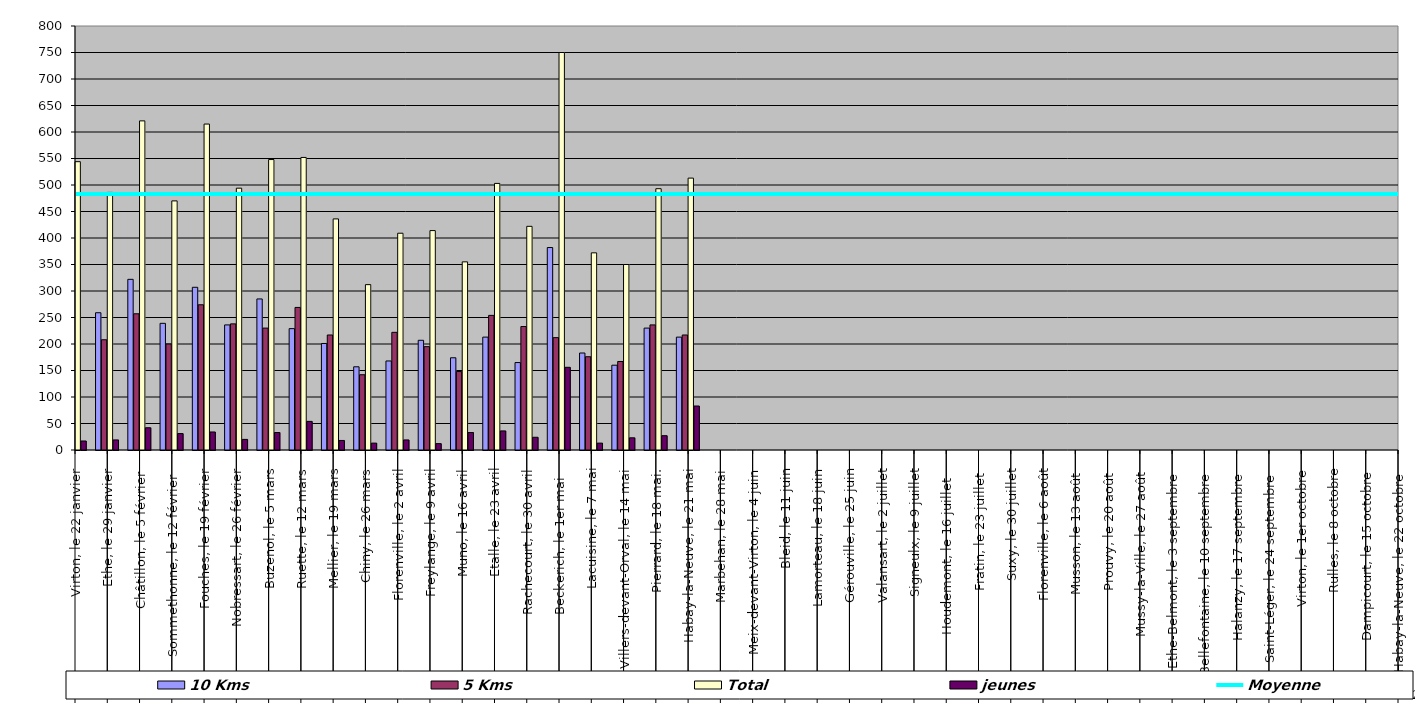
| Category | 10 Kms | 5 Kms | Total | jeunes |
|---|---|---|---|---|
| 0 | 296 | 231 | 544 | 17 |
| 1 | 259 | 208 | 486 | 19 |
| 2 | 322 | 257 | 621 | 42 |
| 3 | 239 | 200 | 470 | 31 |
| 4 | 307 | 274 | 615 | 34 |
| 5 | 236 | 238 | 494 | 20 |
| 6 | 285 | 230 | 548 | 33 |
| 7 | 229 | 269 | 552 | 54 |
| 8 | 201 | 217 | 436 | 18 |
| 9 | 157 | 142 | 312 | 13 |
| 10 | 168 | 222 | 409 | 19 |
| 11 | 207 | 195 | 414 | 12 |
| 12 | 174 | 148 | 355 | 33 |
| 13 | 213 | 254 | 503 | 36 |
| 14 | 165 | 233 | 422 | 24 |
| 15 | 382 | 212 | 750 | 156 |
| 16 | 183 | 176 | 372 | 13 |
| 17 | 160 | 167 | 350 | 23 |
| 18 | 230 | 236 | 493 | 27 |
| 19 | 213 | 217 | 513 | 83 |
| 20 | 0 | 0 | 0 | 0 |
| 21 | 0 | 0 | 0 | 0 |
| 22 | 0 | 0 | 0 | 0 |
| 23 | 0 | 0 | 0 | 0 |
| 24 | 0 | 0 | 0 | 0 |
| 25 | 0 | 0 | 0 | 0 |
| 26 | 0 | 0 | 0 | 0 |
| 27 | 0 | 0 | 0 | 0 |
| 28 | 0 | 0 | 0 | 0 |
| 29 | 0 | 0 | 0 | 0 |
| 30 | 0 | 0 | 0 | 0 |
| 31 | 0 | 0 | 0 | 0 |
| 32 | 0 | 0 | 0 | 0 |
| 33 | 0 | 0 | 0 | 0 |
| 34 | 0 | 0 | 0 | 0 |
| 35 | 0 | 0 | 0 | 0 |
| 36 | 0 | 0 | 0 | 0 |
| 37 | 0 | 0 | 0 | 0 |
| 38 | 0 | 0 | 0 | 0 |
| 39 | 0 | 0 | 0 | 0 |
| 40 | 0 | 0 | 0 | 0 |
| 41 | 0 | 0 | 0 | 0 |